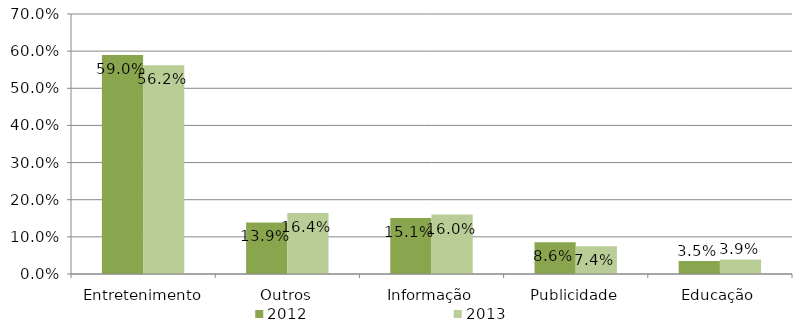
| Category | 2012 | 2013 |
|---|---|---|
| Entretenimento | 0.59 | 0.562 |
| Outros | 0.139 | 0.164 |
| Informação | 0.151 | 0.16 |
| Publicidade | 0.086 | 0.074 |
| Educação | 0.035 | 0.039 |